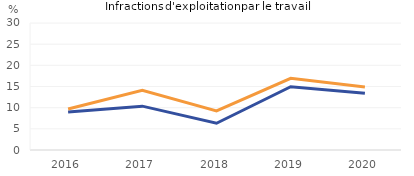
| Category | Affaires poursuivies pour une infraction avec au moins une victime mineure | Auteurs pousuivis pour une infraction avec  au moins une victime mineure |
|---|---|---|
| 2016.0 | 9 | 9.677 |
| 2017.0 | 10.36 | 14.08 |
| 2018.0 | 6.316 | 9.223 |
| 2019.0 | 14.935 | 16.923 |
| 2020.0 | 13.402 | 14.885 |